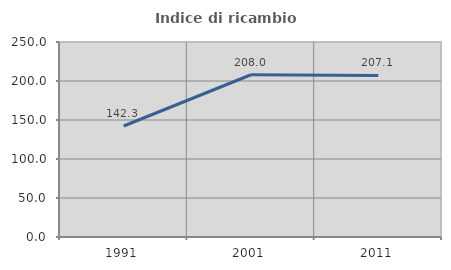
| Category | Indice di ricambio occupazionale  |
|---|---|
| 1991.0 | 142.308 |
| 2001.0 | 208 |
| 2011.0 | 207.143 |